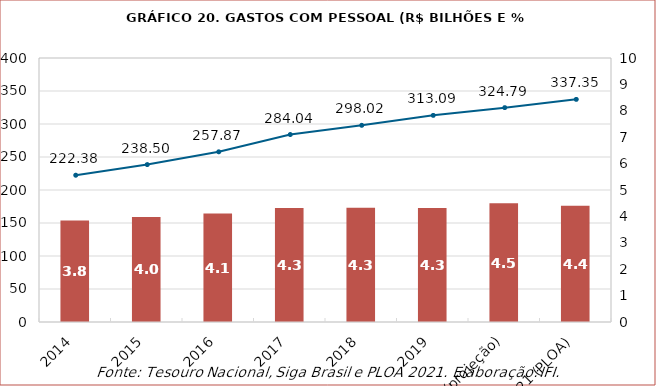
| Category | % PIB |
|---|---|
| 2014 | 3.848 |
| 2015 | 3.978 |
| 2016 | 4.113 |
| 2017 | 4.315 |
| 2018 | 4.326 |
| 2019 | 4.314 |
| 2020 (projeção) | 4.5 |
| 2021 (PLOA) | 4.4 |